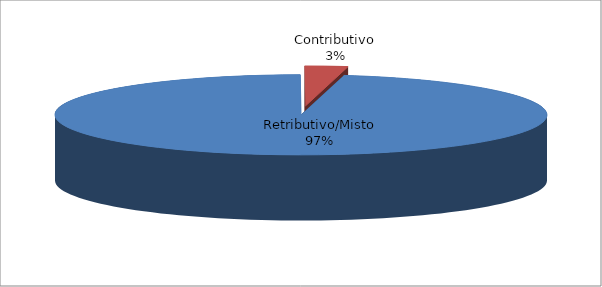
| Category | Series 1 | 60.921 1.772 |
|---|---|---|
| Retributivo/Misto |  | 60921 |
| Contributivo |  | 1772 |